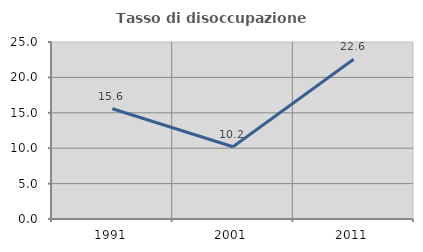
| Category | Tasso di disoccupazione giovanile  |
|---|---|
| 1991.0 | 15.574 |
| 2001.0 | 10.202 |
| 2011.0 | 22.558 |